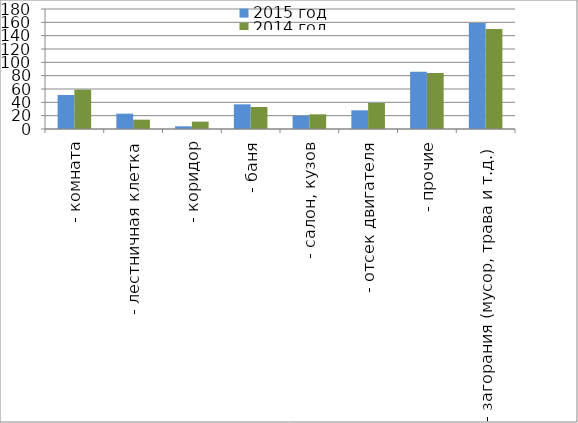
| Category | 2015 год | 2014 год |
|---|---|---|
|  - комната | 51 | 59 |
|  - лестничная клетка | 23 | 14 |
|  - коридор | 4 | 11 |
|  - баня | 37 | 33 |
|  - салон, кузов | 20 | 22 |
|  - отсек двигателя | 28 | 39 |
| - прочие | 86 | 84 |
| - загорания (мусор, трава и т.д.)  | 159 | 150 |